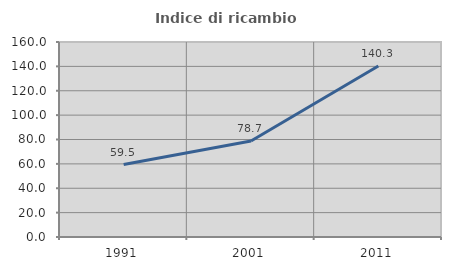
| Category | Indice di ricambio occupazionale  |
|---|---|
| 1991.0 | 59.459 |
| 2001.0 | 78.723 |
| 2011.0 | 140.278 |